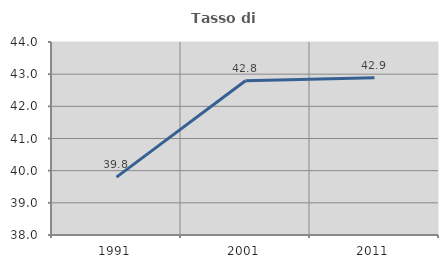
| Category | Tasso di occupazione   |
|---|---|
| 1991.0 | 39.798 |
| 2001.0 | 42.796 |
| 2011.0 | 42.889 |